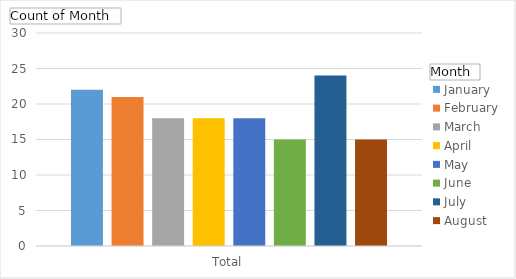
| Category | January | February | March | April | May | June | July | August |
|---|---|---|---|---|---|---|---|---|
| Total | 22 | 21 | 18 | 18 | 18 | 15 | 24 | 15 |